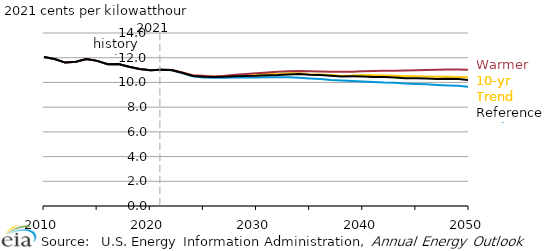
| Category | 10-yr Trend | Cooler | Warmer | Reference |
|---|---|---|---|---|
| 2010.0 | 12.062 | 12.062 | 12.062 | 12.062 |
| 2011.0 | 11.901 | 11.901 | 11.901 | 11.901 |
| 2012.0 | 11.607 | 11.607 | 11.607 | 11.607 |
| 2013.0 | 11.68 | 11.68 | 11.68 | 11.68 |
| 2014.0 | 11.892 | 11.892 | 11.892 | 11.892 |
| 2015.0 | 11.743 | 11.743 | 11.743 | 11.743 |
| 2016.0 | 11.473 | 11.473 | 11.473 | 11.473 |
| 2017.0 | 11.486 | 11.486 | 11.486 | 11.486 |
| 2018.0 | 11.269 | 11.269 | 11.269 | 11.269 |
| 2019.0 | 11.084 | 11.084 | 11.084 | 11.084 |
| 2020.0 | 10.99 | 10.99 | 10.99 | 10.99 |
| 2021.0 | 11.03 | 11.03 | 11.03 | 11.03 |
| 2022.0 | 11.001 | 10.991 | 11.001 | 11.005 |
| 2023.0 | 10.785 | 10.756 | 10.799 | 10.79 |
| 2024.0 | 10.555 | 10.491 | 10.576 | 10.525 |
| 2025.0 | 10.453 | 10.402 | 10.54 | 10.466 |
| 2026.0 | 10.468 | 10.372 | 10.487 | 10.434 |
| 2027.0 | 10.508 | 10.373 | 10.539 | 10.454 |
| 2028.0 | 10.551 | 10.394 | 10.63 | 10.493 |
| 2029.0 | 10.584 | 10.394 | 10.687 | 10.524 |
| 2030.0 | 10.606 | 10.399 | 10.741 | 10.539 |
| 2031.0 | 10.691 | 10.417 | 10.804 | 10.574 |
| 2032.0 | 10.657 | 10.423 | 10.864 | 10.593 |
| 2033.0 | 10.746 | 10.423 | 10.909 | 10.651 |
| 2034.0 | 10.734 | 10.377 | 10.921 | 10.688 |
| 2035.0 | 10.656 | 10.319 | 10.9 | 10.624 |
| 2036.0 | 10.651 | 10.269 | 10.885 | 10.601 |
| 2037.0 | 10.605 | 10.198 | 10.869 | 10.545 |
| 2038.0 | 10.545 | 10.154 | 10.866 | 10.49 |
| 2039.0 | 10.556 | 10.114 | 10.87 | 10.494 |
| 2040.0 | 10.592 | 10.066 | 10.901 | 10.487 |
| 2041.0 | 10.587 | 10.029 | 10.921 | 10.446 |
| 2042.0 | 10.56 | 9.989 | 10.943 | 10.435 |
| 2043.0 | 10.543 | 9.98 | 10.946 | 10.407 |
| 2044.0 | 10.503 | 9.915 | 10.961 | 10.331 |
| 2045.0 | 10.495 | 9.881 | 10.988 | 10.329 |
| 2046.0 | 10.485 | 9.845 | 11.014 | 10.31 |
| 2047.0 | 10.464 | 9.793 | 11.022 | 10.28 |
| 2048.0 | 10.462 | 9.755 | 11.044 | 10.292 |
| 2049.0 | 10.445 | 9.725 | 11.053 | 10.268 |
| 2050.0 | 10.408 | 9.633 | 11.029 | 10.194 |